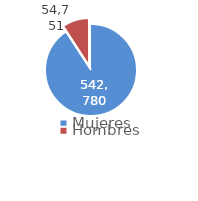
| Category | Series 0 |
|---|---|
| Mujeres | 542780 |
| Hombres | 54751 |